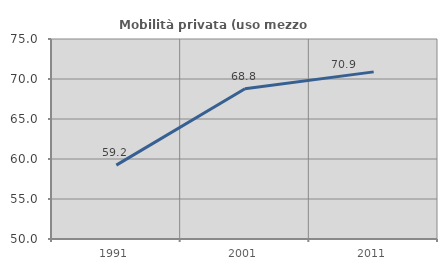
| Category | Mobilità privata (uso mezzo privato) |
|---|---|
| 1991.0 | 59.238 |
| 2001.0 | 68.773 |
| 2011.0 | 70.892 |